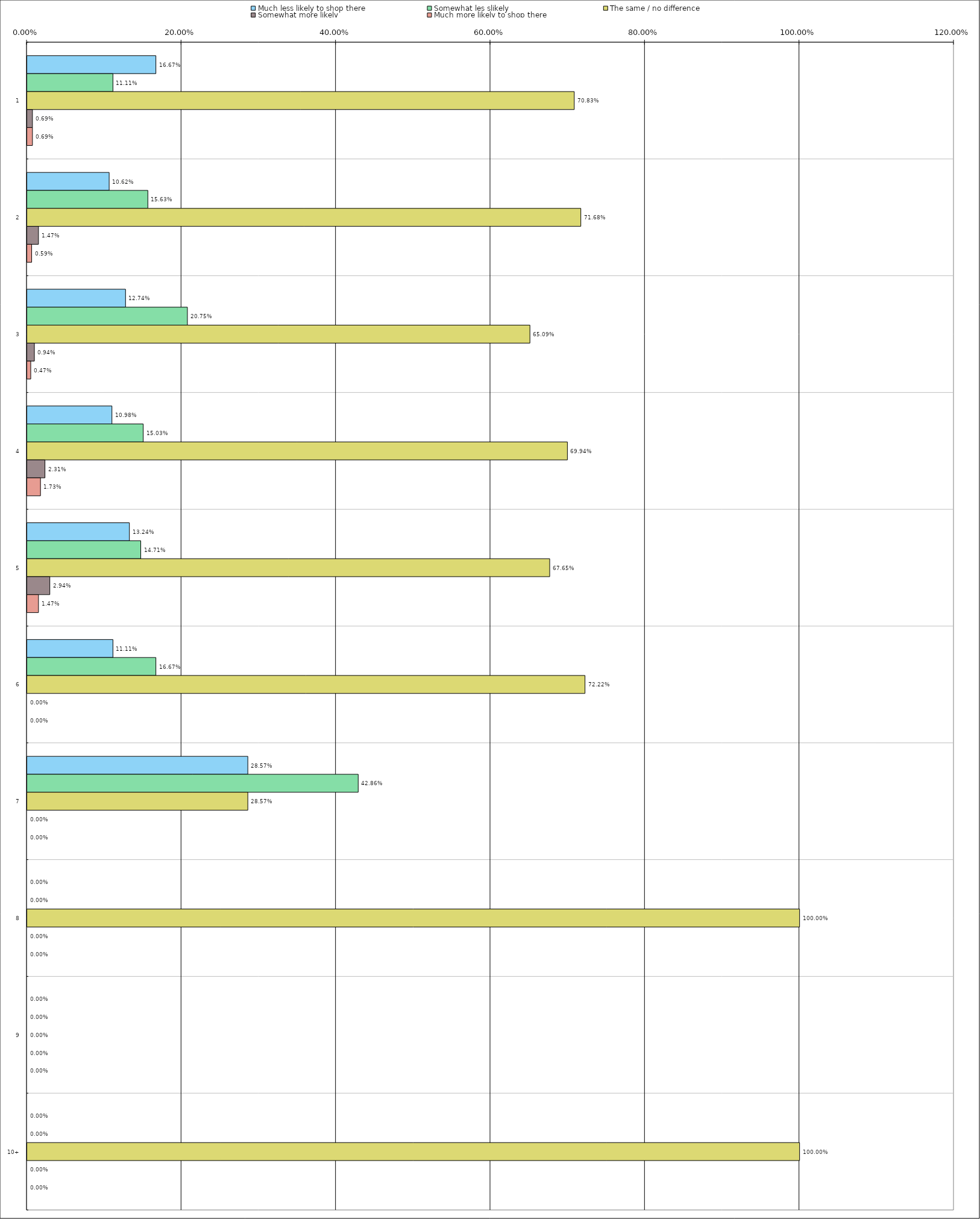
| Category | Much less likely to shop there | Somewhat les slikely | The same / no difference | Somewhat more likely | Much more likely to shop there |
|---|---|---|---|---|---|
| 0 | 0.167 | 0.111 | 0.708 | 0.007 | 0.007 |
| 1 | 0.106 | 0.156 | 0.717 | 0.015 | 0.006 |
| 2 | 0.127 | 0.208 | 0.651 | 0.009 | 0.005 |
| 3 | 0.11 | 0.15 | 0.699 | 0.023 | 0.017 |
| 4 | 0.132 | 0.147 | 0.676 | 0.029 | 0.015 |
| 5 | 0.111 | 0.167 | 0.722 | 0 | 0 |
| 6 | 0.286 | 0.429 | 0.286 | 0 | 0 |
| 7 | 0 | 0 | 1 | 0 | 0 |
| 8 | 0 | 0 | 0 | 0 | 0 |
| 9 | 0 | 0 | 1 | 0 | 0 |